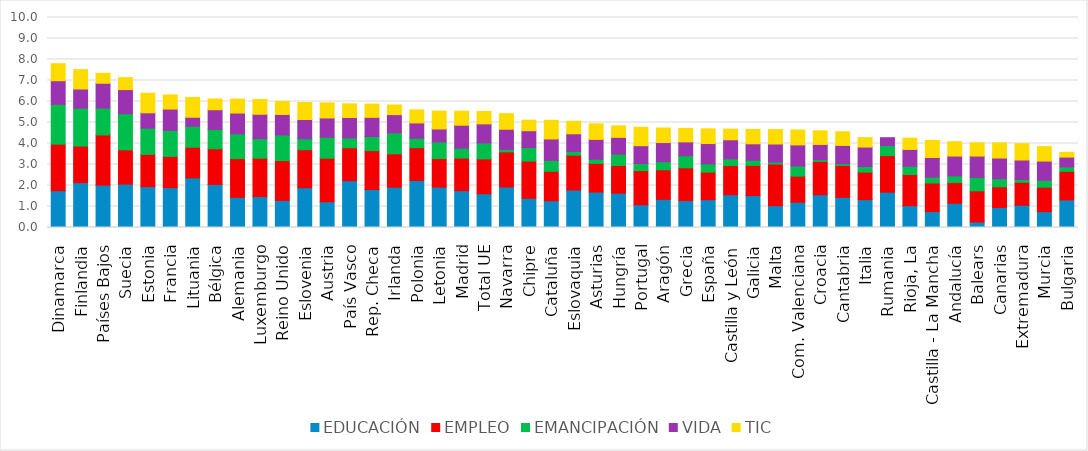
| Category | EDUCACIÓN | EMPLEO | EMANCIPACIÓN | VIDA | TIC |
|---|---|---|---|---|---|
| Dinamarca | 1.752 | 2.217 | 1.895 | 1.125 | 0.812 |
| Finlandia | 2.136 | 1.741 | 1.809 | 0.909 | 0.92 |
| Países Bajos | 2.02 | 2.387 | 1.28 | 1.181 | 0.475 |
| Suecia | 2.067 | 1.633 | 1.716 | 1.151 | 0.569 |
| Estonia | 1.944 | 1.54 | 1.251 | 0.727 | 0.933 |
| Francia | 1.898 | 1.489 | 1.235 | 1.018 | 0.676 |
| Lituania | 2.364 | 1.458 | 1 | 0.429 | 0.941 |
| Bélgica | 2.052 | 1.697 | 0.923 | 0.935 | 0.515 |
| Alemania | 1.436 | 1.844 | 1.18 | 0.991 | 0.664 |
| Luxemburgo | 1.47 | 1.828 | 0.937 | 1.158 | 0.705 |
| Reino Unido | 1.288 | 1.898 | 1.221 | 0.977 | 0.621 |
| Eslovenia | 1.893 | 1.814 | 0.521 | 0.914 | 0.811 |
| Austria | 1.224 | 2.075 | 0.997 | 0.919 | 0.717 |
| País Vasco | 2.229 | 1.568 | 0.469 | 0.972 | 0.653 |
| Rep. Checa | 1.809 | 1.85 | 0.674 | 0.91 | 0.633 |
| Irlanda | 1.918 | 1.59 | 1.002 | 0.866 | 0.458 |
| Polonia | 2.235 | 1.567 | 0.448 | 0.73 | 0.621 |
| Letonia | 1.922 | 1.36 | 0.794 | 0.616 | 0.85 |
| Madrid | 1.752 | 1.553 | 0.474 | 1.091 | 0.669 |
| Total UE | 1.607 | 1.659 | 0.765 | 0.903 | 0.593 |
| Navarra | 1.93 | 1.671 | 0.121 | 0.958 | 0.743 |
| Chipre | 1.39 | 1.77 | 0.647 | 0.802 | 0.499 |
| Cataluña | 1.27 | 1.406 | 0.518 | 1.022 | 0.889 |
| Eslovaquia | 1.783 | 1.659 | 0.181 | 0.839 | 0.597 |
| Asturias | 1.686 | 1.364 | 0.202 | 0.944 | 0.741 |
| Hungría | 1.634 | 1.317 | 0.54 | 0.801 | 0.549 |
| Portugal | 1.086 | 1.621 | 0.339 | 0.85 | 0.877 |
| Aragón | 1.341 | 1.405 | 0.389 | 0.909 | 0.694 |
| Grecia | 1.28 | 1.562 | 0.576 | 0.659 | 0.645 |
| España | 1.325 | 1.312 | 0.396 | 0.963 | 0.701 |
| Castilla y León | 1.56 | 1.39 | 0.322 | 0.905 | 0.508 |
| Galicia | 1.519 | 1.436 | 0.248 | 0.782 | 0.686 |
| Malta | 1.037 | 1.981 | 0.098 | 0.859 | 0.688 |
| Com. Valenciana | 1.204 | 1.241 | 0.481 | 1.007 | 0.712 |
| Croacia | 1.559 | 1.588 | 0.086 | 0.722 | 0.65 |
| Cantabria | 1.436 | 1.519 | 0.082 | 0.872 | 0.649 |
| Italia | 1.328 | 1.311 | 0.265 | 0.927 | 0.447 |
| Rumania | 1.682 | 1.74 | 0.48 | 0.373 | 0 |
| Rioja, La | 1.037 | 1.484 | 0.397 | 0.801 | 0.536 |
| Castilla - La Mancha | 0.757 | 1.362 | 0.281 | 0.933 | 0.817 |
| Andalucía | 1.151 | 0.987 | 0.321 | 0.943 | 0.683 |
| Balears | 0.261 | 1.485 | 0.64 | 1.016 | 0.63 |
| Canarias | 0.956 | 0.983 | 0.387 | 0.983 | 0.722 |
| Extremadura | 1.06 | 1.093 | 0.138 | 0.923 | 0.778 |
| Murcia | 0.754 | 1.166 | 0.33 | 0.914 | 0.687 |
| Bulgaria | 1.313 | 1.358 | 0.217 | 0.464 | 0.229 |